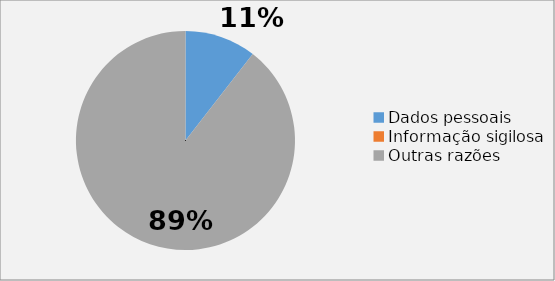
| Category | Series 0 | Series 1 |
|---|---|---|
| Dados pessoais | 0.105 | 0.3 |
| Informação sigilosa | 0 | 0 |
| Outras razões | 0.895 | 0.7 |